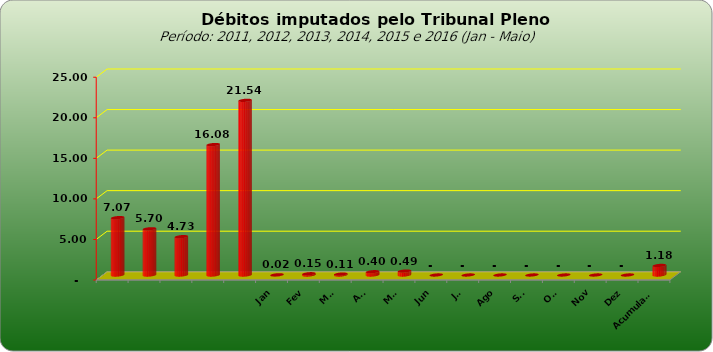
| Category |  7.073.154,74  |
|---|---|
|  | 7073154.74 |
|  | 5698720.25 |
|  | 4727033.51 |
|  | 16081820.48 |
|  | 21535723.6 |
| Jan | 22059.63 |
| Fev | 154318.14 |
| Mar | 112460.95 |
| Abr | 404403.01 |
| Mai | 486409.52 |
| Jun | 0 |
| Jul | 0 |
| Ago | 0 |
| Set | 0 |
| Out | 0 |
| Nov | 0 |
| Dez | 0 |
| Acumulado | 1179651.25 |